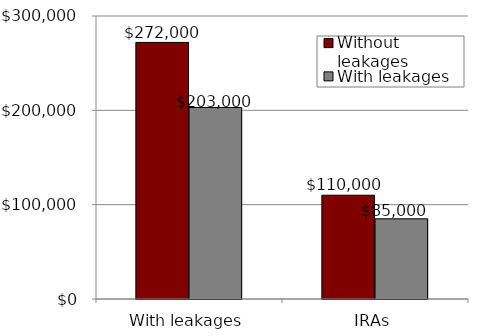
| Category | Without leakages | With leakages |
|---|---|---|
| With leakages | 272000 | 203000 |
| IRAs | 110000 | 85000 |